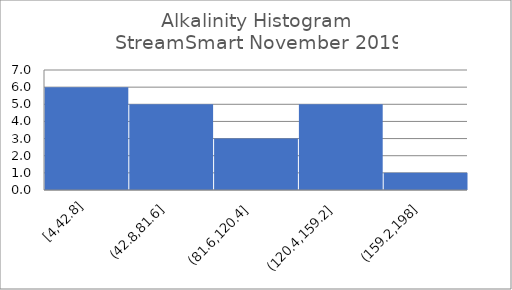
| Category | Max | Mean | Min |
|---|---|---|---|
| 2019-11-01 | 198 | 82.5 | 4 |
| 2019-08-01 | 182 | 93.7 | 10 |
| 2019-05-01 | 188 | 79.7 | 6 |
| 2019-02-01 | 146 | 76.2 | 2 |
| 2018-11-01 | 160 | 90.5 | 6 |
| 2018-08-01 | 174 | 105.579 | 12 |
| 2018-05-01 | 152 | 82.5 | 6 |
| 2018-02-01 | 152 | 86.526 | 6 |
| 2017-11-01 | 184 | 108.7 | 8 |
| 2017-08-01 | 162 | 96.909 | 8 |
| 2017-05-01 | 160 | 75.294 | 8 |
| 2017-02-01 | 152 | 91.3 | 8 |
| 2016-11-01 | 192 | 115.6 | 16 |